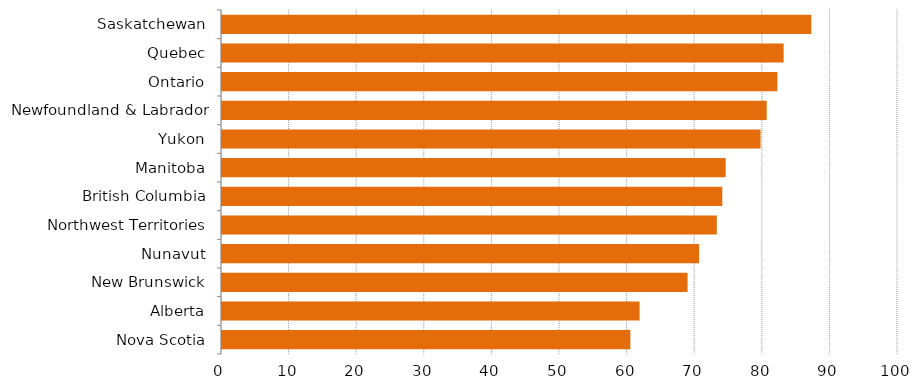
| Category | Series 0 |
|---|---|
| Nova Scotia | 60.41 |
| Alberta | 61.77 |
| New Brunswick | 68.87 |
| Nunavut | 70.58 |
| Northwest Territories | 73.2 |
| British Columbia | 74.01 |
| Manitoba | 74.5 |
| Yukon | 79.67 |
| Newfoundland & Labrador | 80.58 |
| Ontario | 82.15 |
| Quebec | 83.08 |
| Saskatchewan | 87.18 |